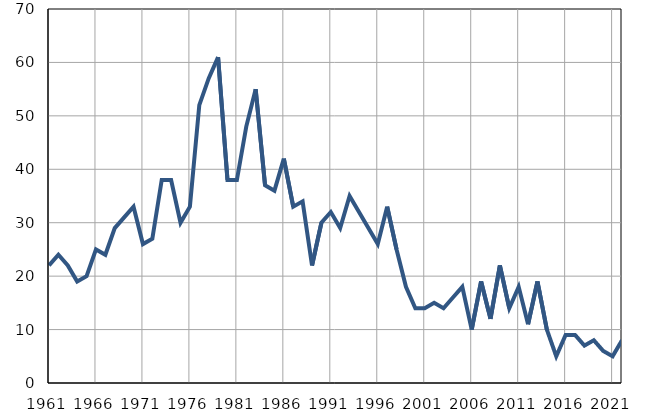
| Category | Умрла 
одојчад |
|---|---|
| 1961.0 | 22 |
| 1962.0 | 24 |
| 1963.0 | 22 |
| 1964.0 | 19 |
| 1965.0 | 20 |
| 1966.0 | 25 |
| 1967.0 | 24 |
| 1968.0 | 29 |
| 1969.0 | 31 |
| 1970.0 | 33 |
| 1971.0 | 26 |
| 1972.0 | 27 |
| 1973.0 | 38 |
| 1974.0 | 38 |
| 1975.0 | 30 |
| 1976.0 | 33 |
| 1977.0 | 52 |
| 1978.0 | 57 |
| 1979.0 | 61 |
| 1980.0 | 38 |
| 1981.0 | 38 |
| 1982.0 | 48 |
| 1983.0 | 55 |
| 1984.0 | 37 |
| 1985.0 | 36 |
| 1986.0 | 42 |
| 1987.0 | 33 |
| 1988.0 | 34 |
| 1989.0 | 22 |
| 1990.0 | 30 |
| 1991.0 | 32 |
| 1992.0 | 29 |
| 1993.0 | 35 |
| 1994.0 | 32 |
| 1995.0 | 29 |
| 1996.0 | 26 |
| 1997.0 | 33 |
| 1998.0 | 25 |
| 1999.0 | 18 |
| 2000.0 | 14 |
| 2001.0 | 14 |
| 2002.0 | 15 |
| 2003.0 | 14 |
| 2004.0 | 16 |
| 2005.0 | 18 |
| 2006.0 | 10 |
| 2007.0 | 19 |
| 2008.0 | 12 |
| 2009.0 | 22 |
| 2010.0 | 14 |
| 2011.0 | 18 |
| 2012.0 | 11 |
| 2013.0 | 19 |
| 2014.0 | 10 |
| 2015.0 | 5 |
| 2016.0 | 9 |
| 2017.0 | 9 |
| 2018.0 | 7 |
| 2019.0 | 8 |
| 2020.0 | 6 |
| 2021.0 | 5 |
| 2022.0 | 8 |